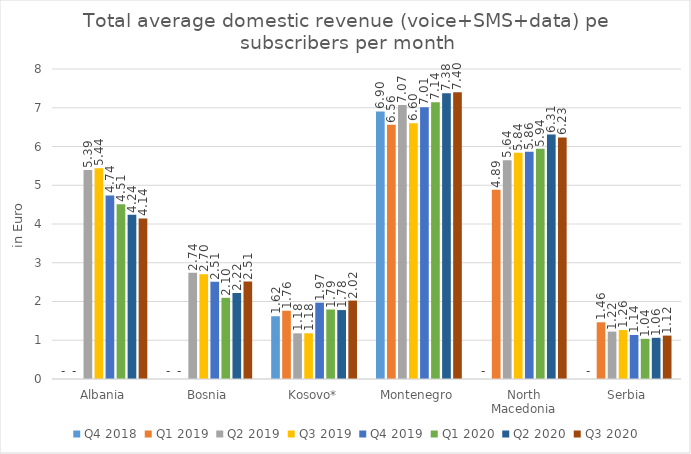
| Category | Q4 2018 | Q1 2019 | Q2 2019 | Q3 2019 | Q4 2019 | Q1 2020 | Q2 2020 | Q3 2020 |
|---|---|---|---|---|---|---|---|---|
| Albania | 0 | 0 | 5.393 | 5.442 | 4.736 | 4.51 | 4.238 | 4.143 |
| Bosnia | 0 | 0 | 2.741 | 2.7 | 2.509 | 2.095 | 2.218 | 2.515 |
| Kosovo* | 1.619 | 1.762 | 1.178 | 1.18 | 1.97 | 1.793 | 1.779 | 2.024 |
| Montenegro | 6.904 | 6.558 | 7.068 | 6.602 | 7.014 | 7.143 | 7.376 | 7.399 |
| North Macedonia | 0 | 4.886 | 5.643 | 5.839 | 5.862 | 5.943 | 6.309 | 6.234 |
| Serbia | 0 | 1.464 | 1.223 | 1.263 | 1.135 | 1.038 | 1.063 | 1.12 |